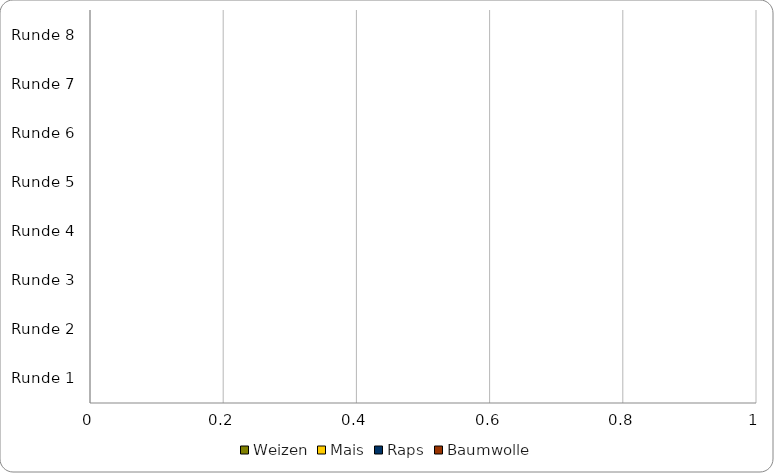
| Category | Weizen | Mais | Raps | Baumwolle |
|---|---|---|---|---|
| Runde 8 | 0 | 0 | 0 | 0 |
| Runde 7 | 0 | 0 | 0 | 0 |
| Runde 6 | 0 | 0 | 0 | 0 |
| Runde 5 | 0 | 0 | 0 | 0 |
| Runde 4 | 0 | 0 | 0 | 0 |
| Runde 3 | 0 | 0 | 0 | 0 |
| Runde 2 | 0 | 0 | 0 | 0 |
| Runde 1 | 0 | 0 | 0 | 0 |